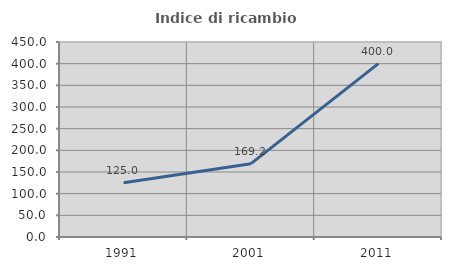
| Category | Indice di ricambio occupazionale  |
|---|---|
| 1991.0 | 125 |
| 2001.0 | 169.231 |
| 2011.0 | 400 |